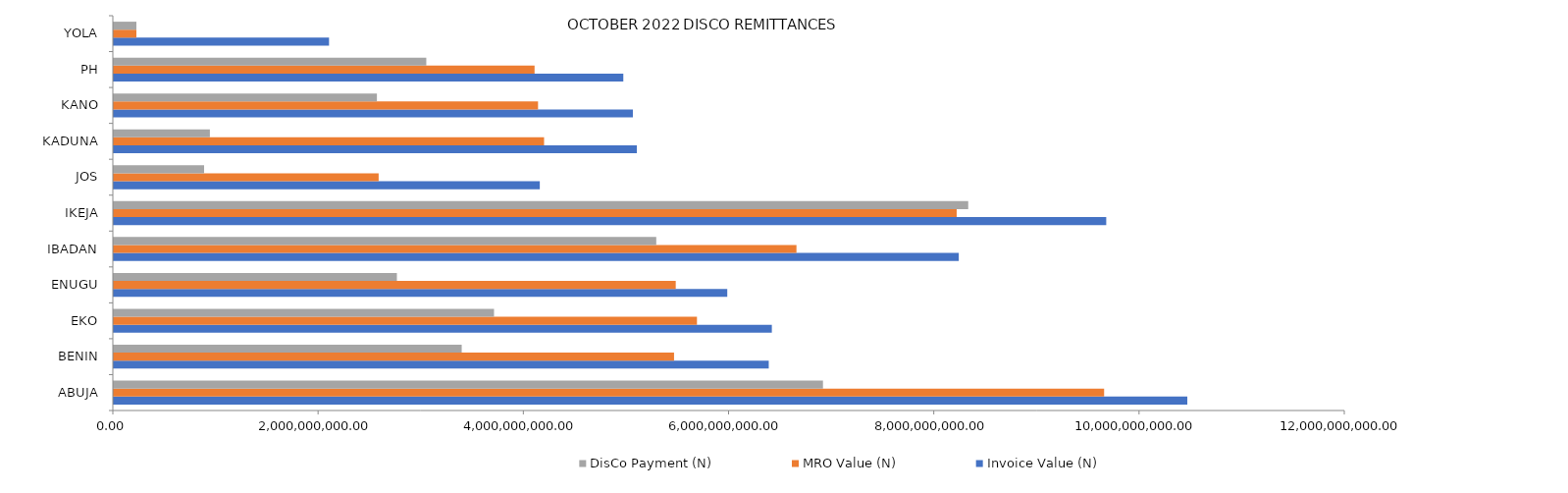
| Category | Invoice Value (N) | MRO Value (N) | DisCo Payment (N) |
|---|---|---|---|
| ABUJA | 10460867371.49 | 9650150150.2 | 6910500950.63 |
| BENIN | 6382120427.34 | 5459265813.547 | 3390046969.32 |
| EKO | 6412253512.82 | 5682539063.061 | 3704962396.09 |
| ENUGU | 5977834144.27 | 5475696076.151 | 2758471954.77 |
| IBADAN | 8233855343.79 | 6652131732.248 | 5285782625.59 |
| IKEJA | 9670766801.92 | 8213382244.871 | 8325792041.9 |
| JOS | 4150975820.66 | 2580661667.704 | 879655876.07 |
| KADUNA | 5096844505.42 | 4192664290.158 | 936128180.46 |
| KANO | 5057963962.43 | 4133873946.494 | 2563654309.24 |
| PH | 4964876417.33 | 4099994945.431 | 3044827735.29 |
| YOLA | 2097254575.99 | 220211730.479 | 220211730.48 |